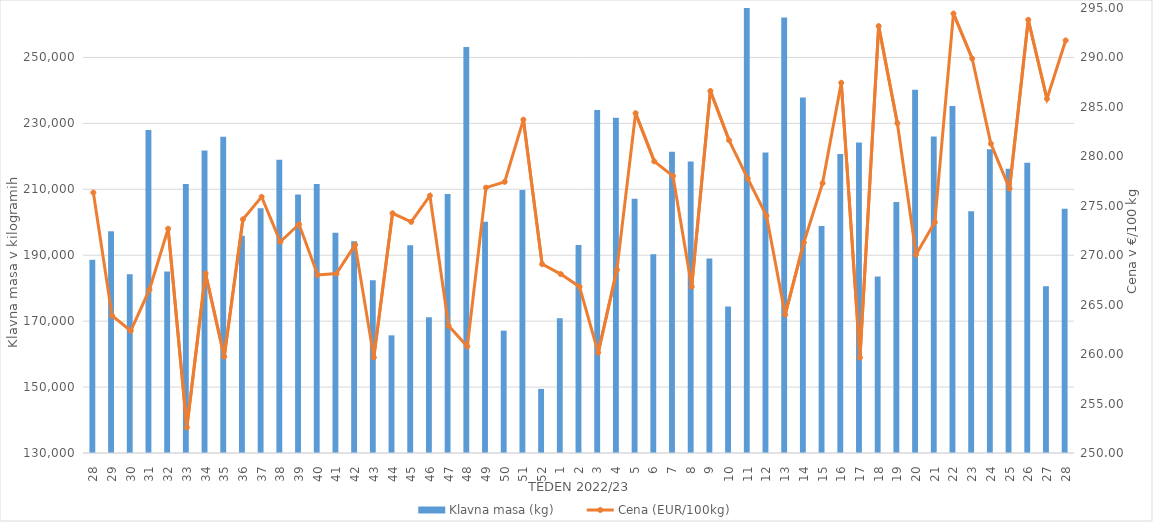
| Category | Klavna masa (kg) |
|---|---|
| 28.0 | 188601 |
| 29.0 | 197293 |
| 30.0 | 184259 |
| 31.0 | 228023 |
| 32.0 | 185079 |
| 33.0 | 211612 |
| 34.0 | 221748 |
| 35.0 | 225927 |
| 36.0 | 195924 |
| 37.0 | 204224 |
| 38.0 | 218966 |
| 39.0 | 208403 |
| 40.0 | 211635 |
| 41.0 | 196841 |
| 42.0 | 194271 |
| 43.0 | 182399 |
| 44.0 | 165696 |
| 45.0 | 193022 |
| 46.0 | 171172 |
| 47.0 | 208597 |
| 48.0 | 253151 |
| 49.0 | 200117 |
| 50.0 | 167119 |
| 51.0 | 209797 |
| 52.0 | 149439 |
| 1.0 | 170843 |
| 2.0 | 193093 |
| 3.0 | 234042 |
| 4.0 | 231737 |
| 5.0 | 207136 |
| 6.0 | 190311 |
| 7.0 | 221366 |
| 8.0 | 218470 |
| 9.0 | 189006 |
| 10.0 | 174425 |
| 11.0 | 265476 |
| 12.0 | 221171 |
| 13.0 | 262102 |
| 14.0 | 237813 |
| 15.0 | 198828 |
| 16.0 | 220686 |
| 17.0 | 224192 |
| 18.0 | 183508 |
| 19.0 | 206133 |
| 20.0 | 240223 |
| 21.0 | 226050 |
| 22.0 | 235273 |
| 23.0 | 203306 |
| 24.0 | 222178 |
| 25.0 | 216259 |
| 26.0 | 218064 |
| 27.0 | 180556 |
| 28.0 | 204078 |